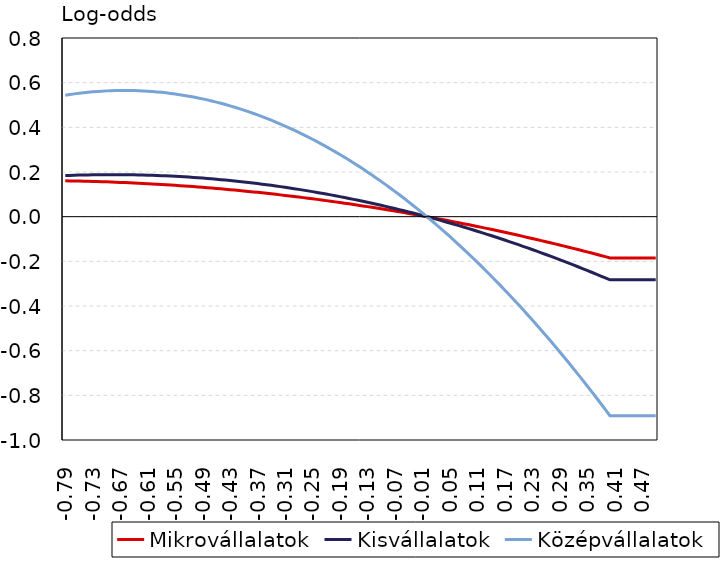
| Category | Mikrovállalatok | Kisvállalatok | Középvállalatok |
|---|---|---|---|
| -0.79 | 0.16 | 0.184 | 0.544 |
| -0.78 | 0.16 | 0.185 | 0.547 |
| -0.77 | 0.16 | 0.185 | 0.55 |
| -0.76 | 0.159 | 0.186 | 0.553 |
| -0.75 | 0.159 | 0.187 | 0.555 |
| -0.74 | 0.158 | 0.187 | 0.557 |
| -0.73 | 0.158 | 0.187 | 0.559 |
| -0.72 | 0.157 | 0.188 | 0.561 |
| -0.71 | 0.156 | 0.188 | 0.562 |
| -0.7 | 0.156 | 0.188 | 0.563 |
| -0.69 | 0.155 | 0.188 | 0.564 |
| -0.68 | 0.154 | 0.188 | 0.565 |
| -0.67 | 0.153 | 0.188 | 0.565 |
| -0.66 | 0.153 | 0.188 | 0.565 |
| -0.65 | 0.152 | 0.188 | 0.565 |
| -0.64 | 0.151 | 0.187 | 0.565 |
| -0.63 | 0.15 | 0.187 | 0.564 |
| -0.62 | 0.149 | 0.186 | 0.563 |
| -0.61 | 0.148 | 0.186 | 0.562 |
| -0.6 | 0.147 | 0.185 | 0.56 |
| -0.59 | 0.145 | 0.184 | 0.559 |
| -0.58 | 0.144 | 0.184 | 0.557 |
| -0.57 | 0.143 | 0.183 | 0.554 |
| -0.56 | 0.142 | 0.182 | 0.552 |
| -0.55 | 0.14 | 0.181 | 0.549 |
| -0.54 | 0.139 | 0.18 | 0.546 |
| -0.53 | 0.138 | 0.178 | 0.543 |
| -0.52 | 0.136 | 0.177 | 0.539 |
| -0.51 | 0.135 | 0.176 | 0.536 |
| -0.5 | 0.133 | 0.174 | 0.532 |
| -0.49 | 0.131 | 0.173 | 0.527 |
| -0.48 | 0.13 | 0.171 | 0.523 |
| -0.47 | 0.128 | 0.169 | 0.518 |
| -0.46 | 0.126 | 0.168 | 0.513 |
| -0.45 | 0.125 | 0.166 | 0.508 |
| -0.44 | 0.123 | 0.164 | 0.502 |
| -0.429999999999999 | 0.121 | 0.162 | 0.496 |
| -0.419999999999999 | 0.119 | 0.16 | 0.49 |
| -0.409999999999999 | 0.117 | 0.158 | 0.484 |
| -0.399999999999999 | 0.115 | 0.155 | 0.477 |
| -0.389999999999999 | 0.113 | 0.153 | 0.47 |
| -0.379999999999999 | 0.111 | 0.151 | 0.463 |
| -0.369999999999999 | 0.109 | 0.148 | 0.456 |
| -0.359999999999999 | 0.107 | 0.146 | 0.448 |
| -0.349999999999999 | 0.104 | 0.143 | 0.44 |
| -0.339999999999999 | 0.102 | 0.14 | 0.432 |
| -0.329999999999999 | 0.1 | 0.137 | 0.423 |
| -0.319999999999999 | 0.098 | 0.134 | 0.415 |
| -0.309999999999999 | 0.095 | 0.132 | 0.406 |
| -0.299999999999999 | 0.093 | 0.128 | 0.397 |
| -0.289999999999999 | 0.09 | 0.125 | 0.387 |
| -0.279999999999999 | 0.088 | 0.122 | 0.377 |
| -0.269999999999999 | 0.085 | 0.119 | 0.367 |
| -0.259999999999999 | 0.083 | 0.115 | 0.357 |
| -0.249999999999999 | 0.08 | 0.112 | 0.347 |
| -0.239999999999999 | 0.077 | 0.109 | 0.336 |
| -0.229999999999999 | 0.075 | 0.105 | 0.325 |
| -0.219999999999999 | 0.072 | 0.101 | 0.314 |
| -0.209999999999999 | 0.069 | 0.097 | 0.302 |
| -0.199999999999999 | 0.066 | 0.094 | 0.29 |
| -0.189999999999999 | 0.063 | 0.09 | 0.278 |
| -0.179999999999999 | 0.06 | 0.086 | 0.266 |
| -0.169999999999999 | 0.057 | 0.082 | 0.253 |
| -0.159999999999999 | 0.054 | 0.077 | 0.24 |
| -0.149999999999999 | 0.051 | 0.073 | 0.227 |
| -0.139999999999999 | 0.048 | 0.069 | 0.214 |
| -0.129999999999999 | 0.045 | 0.064 | 0.2 |
| -0.119999999999999 | 0.042 | 0.06 | 0.187 |
| -0.109999999999999 | 0.039 | 0.055 | 0.172 |
| -0.099999999999999 | 0.035 | 0.051 | 0.158 |
| -0.089999999999999 | 0.032 | 0.046 | 0.143 |
| -0.079999999999999 | 0.029 | 0.041 | 0.129 |
| -0.069999999999999 | 0.025 | 0.036 | 0.113 |
| -0.0599999999999991 | 0.022 | 0.031 | 0.098 |
| -0.049999999999999 | 0.018 | 0.026 | 0.082 |
| -0.039999999999999 | 0.015 | 0.021 | 0.066 |
| -0.029999999999999 | 0.011 | 0.016 | 0.05 |
| -0.019999999999999 | 0.007 | 0.011 | 0.034 |
| -0.00999999999999901 | 0.004 | 0.005 | 0.017 |
| 0.0 | 0 | 0 | 0 |
| 0.01 | -0.004 | -0.006 | -0.017 |
| 0.02 | -0.008 | -0.011 | -0.035 |
| 0.03 | -0.011 | -0.017 | -0.052 |
| 0.04 | -0.015 | -0.023 | -0.07 |
| 0.05 | -0.019 | -0.028 | -0.089 |
| 0.0600000000000001 | -0.023 | -0.034 | -0.107 |
| 0.0700000000000001 | -0.027 | -0.04 | -0.126 |
| 0.0800000000000001 | -0.031 | -0.046 | -0.145 |
| 0.0900000000000001 | -0.035 | -0.053 | -0.164 |
| 0.1 | -0.04 | -0.059 | -0.184 |
| 0.11 | -0.044 | -0.065 | -0.204 |
| 0.12 | -0.048 | -0.071 | -0.224 |
| 0.13 | -0.052 | -0.078 | -0.244 |
| 0.14 | -0.057 | -0.085 | -0.265 |
| 0.15 | -0.061 | -0.091 | -0.286 |
| 0.16 | -0.065 | -0.098 | -0.307 |
| 0.17 | -0.07 | -0.105 | -0.328 |
| 0.18 | -0.074 | -0.112 | -0.35 |
| 0.19 | -0.079 | -0.119 | -0.372 |
| 0.2 | -0.084 | -0.126 | -0.394 |
| 0.21 | -0.088 | -0.133 | -0.416 |
| 0.22 | -0.093 | -0.14 | -0.439 |
| 0.23 | -0.098 | -0.147 | -0.462 |
| 0.24 | -0.102 | -0.154 | -0.485 |
| 0.25 | -0.107 | -0.162 | -0.508 |
| 0.26 | -0.112 | -0.169 | -0.532 |
| 0.27 | -0.117 | -0.177 | -0.556 |
| 0.28 | -0.122 | -0.185 | -0.58 |
| 0.29 | -0.127 | -0.192 | -0.605 |
| 0.3 | -0.132 | -0.2 | -0.629 |
| 0.31 | -0.137 | -0.208 | -0.654 |
| 0.32 | -0.142 | -0.216 | -0.68 |
| 0.33 | -0.147 | -0.224 | -0.705 |
| 0.34 | -0.152 | -0.232 | -0.731 |
| 0.35 | -0.158 | -0.241 | -0.757 |
| 0.36 | -0.163 | -0.249 | -0.783 |
| 0.37 | -0.168 | -0.257 | -0.81 |
| 0.38 | -0.174 | -0.266 | -0.837 |
| 0.39 | -0.179 | -0.274 | -0.864 |
| 0.4 | -0.185 | -0.283 | -0.891 |
| 0.41 | -0.185 | -0.283 | -0.891 |
| 0.42 | -0.185 | -0.283 | -0.891 |
| 0.43 | -0.185 | -0.283 | -0.891 |
| 0.44 | -0.185 | -0.283 | -0.891 |
| 0.45 | -0.185 | -0.283 | -0.891 |
| 0.46 | -0.185 | -0.283 | -0.891 |
| 0.47 | -0.185 | -0.283 | -0.891 |
| 0.48 | -0.185 | -0.283 | -0.891 |
| 0.49 | -0.185 | -0.283 | -0.891 |
| 0.5 | -0.185 | -0.283 | -0.891 |